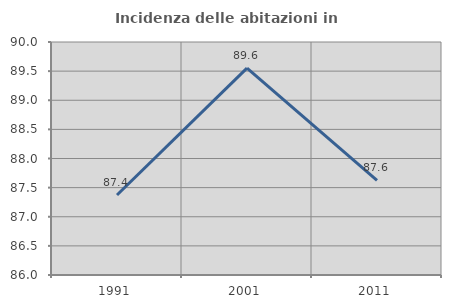
| Category | Incidenza delle abitazioni in proprietà  |
|---|---|
| 1991.0 | 87.374 |
| 2001.0 | 89.552 |
| 2011.0 | 87.624 |